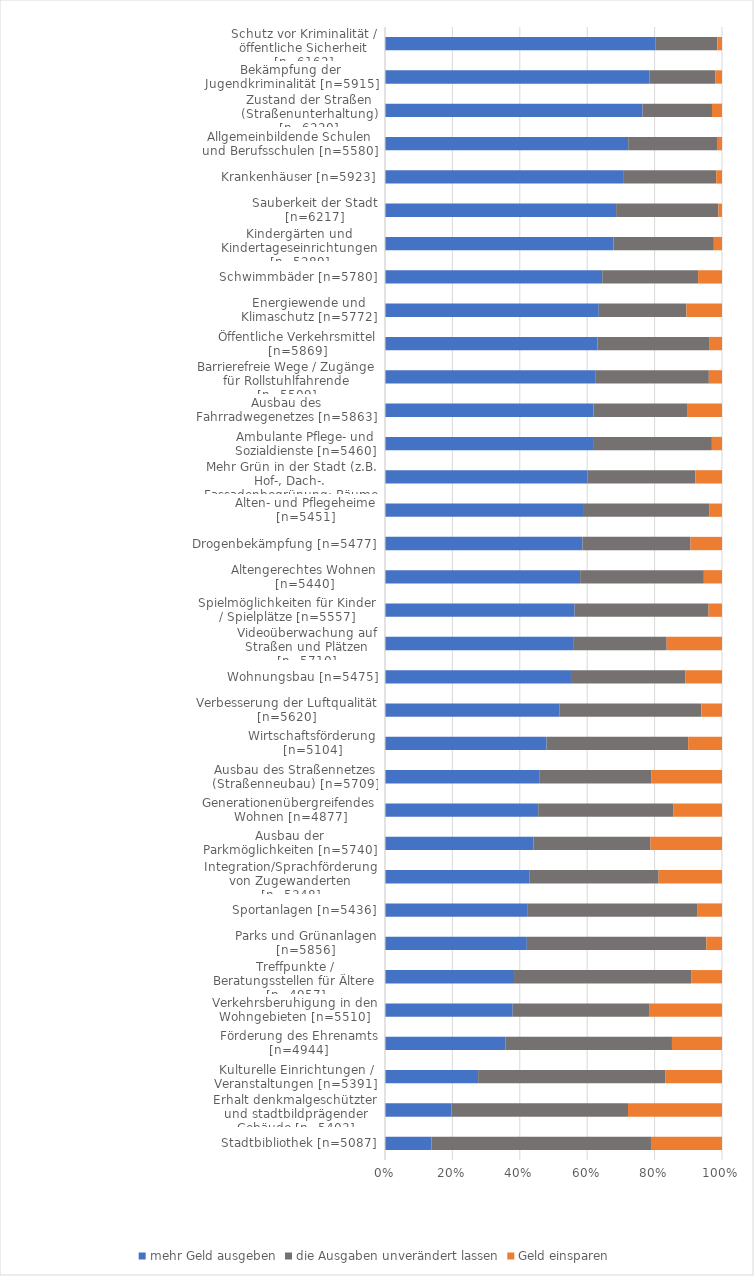
| Category | mehr Geld ausgeben | die Ausgaben unverändert lassen | Geld einsparen |
|---|---|---|---|
| Stadtbibliothek [n=5087] | 701 | 3314 | 1072 |
| Erhalt denkmalgeschützter und stadtbildprägender Gebäude [n=5403] | 1064 | 2832 | 1507 |
| Kulturelle Einrichtungen / Veranstaltungen [n=5391] | 1490 | 2992 | 909 |
| Förderung des Ehrenamts [n=4944] | 1770 | 2440 | 734 |
| Verkehrsberuhigung in den Wohngebieten [n=5510] | 2088 | 2240 | 1182 |
| Treffpunkte / Beratungsstellen für Ältere [n=4957] | 1898 | 2605 | 454 |
| Parks und Grünanlagen [n=5856] | 2465 | 3120 | 271 |
| Sportanlagen [n=5436] | 2304 | 2730 | 402 |
| Integration/Sprachförderung von Zugewanderten [n=5348] | 2289 | 2054 | 1005 |
| Ausbau der Parkmöglichkeiten [n=5740] | 2531 | 1991 | 1218 |
| Generationenübergreifendes Wohnen [n=4877] | 2217 | 1953 | 707 |
| Ausbau des Straßennetzes (Straßenneubau) [n=5709] | 2612 | 1904 | 1193 |
| Wirtschaftsförderung [n=5104] | 2447 | 2145 | 512 |
| Verbesserung der Luftqualität [n=5620] | 2906 | 2370 | 344 |
| Wohnungsbau [n=5475] | 3021 | 1862 | 592 |
| Videoüberwachung auf Straßen und Plätzen [n=5710] | 3200 | 1573 | 937 |
| Spielmöglichkeiten für Kinder / Spielplätze [n=5557] | 3127 | 2209 | 221 |
| Altengerechtes Wohnen [n=5440] | 3150 | 1997 | 293 |
| Drogenbekämpfung [n=5477] | 3208 | 1758 | 511 |
| Alten- und Pflegeheime [n=5451] | 3218 | 2025 | 208 |
| Mehr Grün in der Stadt (z.B. Hof-, Dach-. Fassadenbegrünung; Bäume am Straßenrand) [n=5923] | 3561 | 1893 | 469 |
| Ambulante Pflege- und Sozialdienste [n=5460] | 3371 | 1925 | 164 |
| Ausbau des Fahrradwegenetzes [n=5863] | 3628 | 1627 | 608 |
| Barrierefreie Wege / Zugänge für Rollstuhlfahrende [n=5509] | 3446 | 1848 | 215 |
| Öffentliche Verkehrsmittel [n=5869] | 3702 | 1953 | 214 |
| Energiewende und Klimaschutz [n=5772] | 3662 | 1501 | 609 |
| Schwimmbäder [n=5780] | 3726 | 1644 | 410 |
| Kindergärten und Kindertageseinrichtungen [n=5289] | 3585 | 1576 | 128 |
| Sauberkeit der Stadt [n=6217] | 4264 | 1886 | 67 |
| Krankenhäuser [n=5923] | 4185 | 1637 | 101 |
| Allgemeinbildende Schulen und Berufsschulen [n=5580] | 4027 | 1470 | 83 |
| Zustand der Straßen (Straßenunterhaltung) [n=6220] | 4753 | 1282 | 185 |
| Bekämpfung der Jugendkriminalität [n=5915] | 4645 | 1156 | 114 |
| Schutz vor Kriminalität / öffentliche Sicherheit [n=6162] | 4950 | 1129 | 83 |